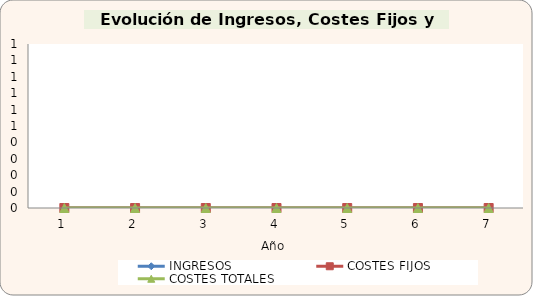
| Category | INGRESOS | COSTES FIJOS | COSTES TOTALES |
|---|---|---|---|
| 1.0 | 0 | 0 | 0 |
| 2.0 | 0 | 0 | 0 |
| 3.0 | 0 | 0 | 0 |
| 4.0 | 0 | 0 | 0 |
| 5.0 | 0 | 0 | 0 |
| 6.0 | 0 | 0 | 0 |
| 7.0 | 0 | 0 | 0 |